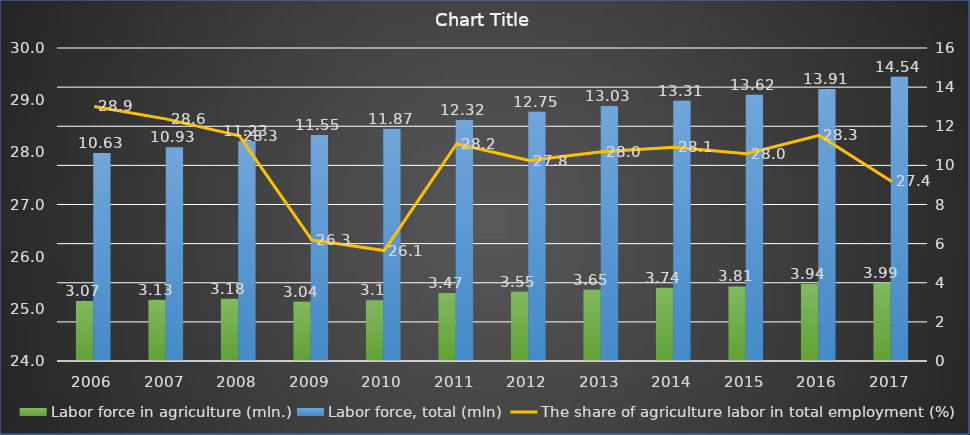
| Category | Labor force in agriculture (mln.) | Labor force, total (mln) |
|---|---|---|
| 2006.0 | 3.07 | 10.63 |
| 2007.0 | 3.13 | 10.93 |
| 2008.0 | 3.18 | 11.23 |
| 2009.0 | 3.04 | 11.55 |
| 2010.0 | 3.1 | 11.87 |
| 2011.0 | 3.47 | 12.32 |
| 2012.0 | 3.55 | 12.75 |
| 2013.0 | 3.65 | 13.03 |
| 2014.0 | 3.74 | 13.31 |
| 2015.0 | 3.81 | 13.62 |
| 2016.0 | 3.94 | 13.91 |
| 2017.0 | 3.99 | 14.54 |